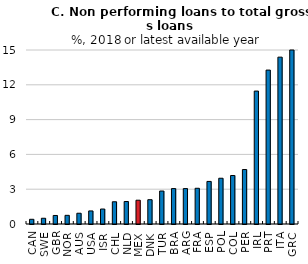
| Category | Series 0 |
|---|---|
| CAN | 0.406 |
| SWE | 0.495 |
| GBR | 0.735 |
| NOR | 0.746 |
| AUS | 0.927 |
| USA | 1.127 |
| ISR | 1.291 |
| CHL | 1.916 |
| NLD | 1.938 |
| MEX | 2.051 |
| DNK | 2.096 |
| TUR | 2.843 |
| BRA | 3.053 |
| ARG | 3.053 |
| FRA | 3.08 |
| ESP | 3.67 |
| POL | 3.944 |
| COL | 4.18 |
| PER | 4.695 |
| IRL | 11.459 |
| PRT | 13.268 |
| ITA | 14.383 |
| GRC | 45.572 |